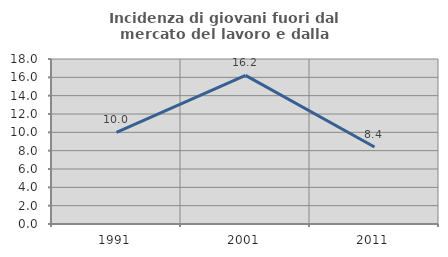
| Category | Incidenza di giovani fuori dal mercato del lavoro e dalla formazione  |
|---|---|
| 1991.0 | 10 |
| 2001.0 | 16.216 |
| 2011.0 | 8.397 |